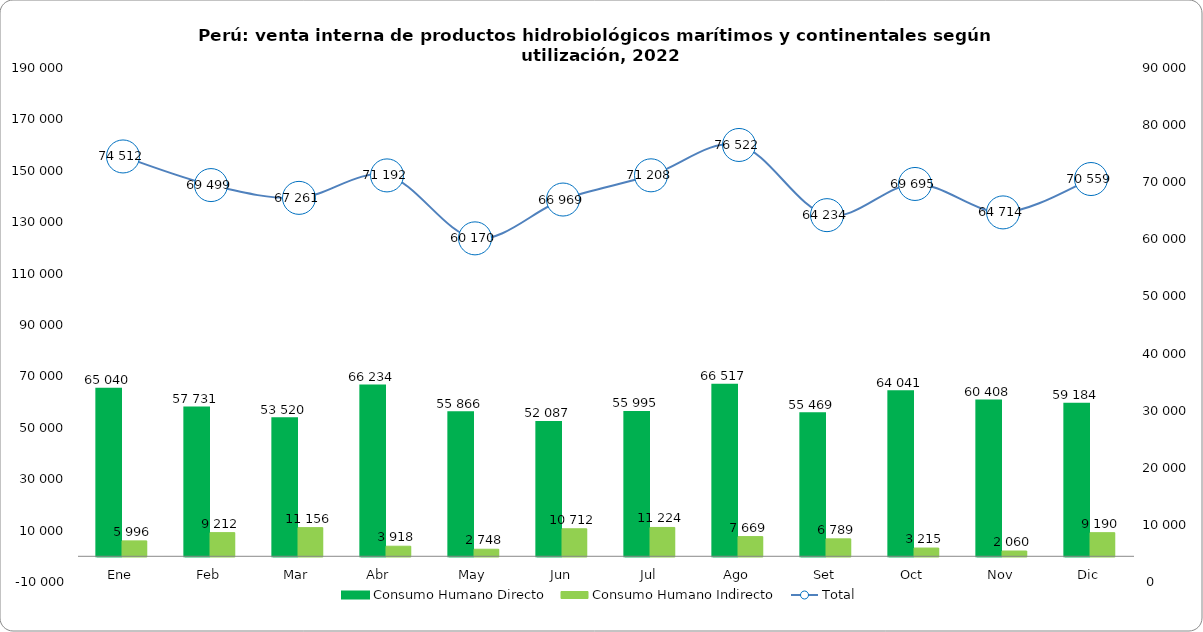
| Category | Consumo Humano Directo | Consumo Humano Indirecto |
|---|---|---|
| Ene | 65039.83 | 5995.542 |
| Feb | 57731.24 | 9211.535 |
| Mar | 53519.903 | 11155.73 |
| Abr    | 66234.462 | 3917.505 |
| May | 55865.651 | 2747.551 |
| Jun | 52087.082 | 10712.299 |
| Jul | 55995.479 | 11223.616 |
| Ago | 66517.389 | 7669.254 |
| Set | 55468.661 | 6789.268 |
| Oct | 64041.258 | 3215.46 |
| Nov | 60408.355 | 2059.891 |
| Dic | 59184.258 | 9190.419 |